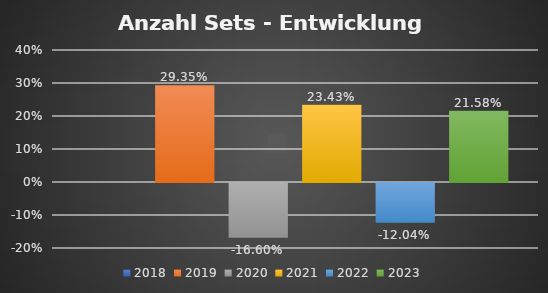
| Category | 2018 | 2019 | 2020 | 2021 | 2022 | 2023 |
|---|---|---|---|---|---|---|
| % mehr Sets |  | 0.293 | -0.166 | 0.234 | -0.12 | 0.216 |